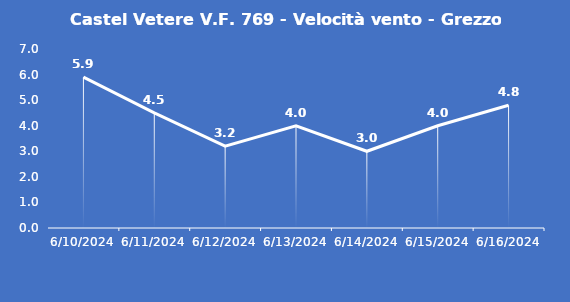
| Category | Castel Vetere V.F. 769 - Velocità vento - Grezzo (m/s) |
|---|---|
| 6/10/24 | 5.9 |
| 6/11/24 | 4.5 |
| 6/12/24 | 3.2 |
| 6/13/24 | 4 |
| 6/14/24 | 3 |
| 6/15/24 | 4 |
| 6/16/24 | 4.8 |